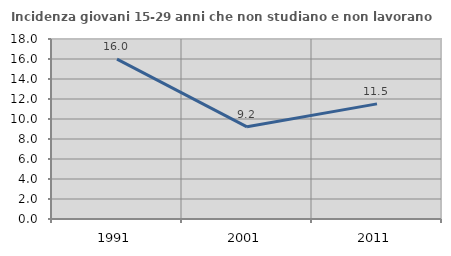
| Category | Incidenza giovani 15-29 anni che non studiano e non lavorano  |
|---|---|
| 1991.0 | 15.986 |
| 2001.0 | 9.22 |
| 2011.0 | 11.511 |